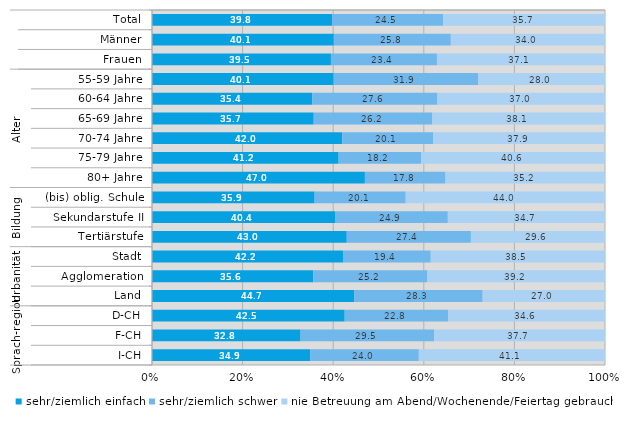
| Category | sehr/ziemlich einfach | sehr/ziemlich schwer | nie Betreuung am Abend/Wochenende/Feiertag gebraucht |
|---|---|---|---|
| 0 | 39.8 | 24.5 | 35.7 |
| 1 | 40.1 | 25.8 | 34 |
| 2 | 39.5 | 23.4 | 37.1 |
| 3 | 40.1 | 31.9 | 28 |
| 4 | 35.4 | 27.6 | 37 |
| 5 | 35.7 | 26.2 | 38.1 |
| 6 | 42 | 20.1 | 37.9 |
| 7 | 41.2 | 18.2 | 40.6 |
| 8 | 47 | 17.8 | 35.2 |
| 9 | 35.9 | 20.1 | 44 |
| 10 | 40.4 | 24.9 | 34.7 |
| 11 | 43 | 27.4 | 29.6 |
| 12 | 42.2 | 19.4 | 38.5 |
| 13 | 35.6 | 25.2 | 39.2 |
| 14 | 44.7 | 28.3 | 27 |
| 15 | 42.5 | 22.8 | 34.6 |
| 16 | 32.8 | 29.5 | 37.7 |
| 17 | 34.9 | 24 | 41.1 |